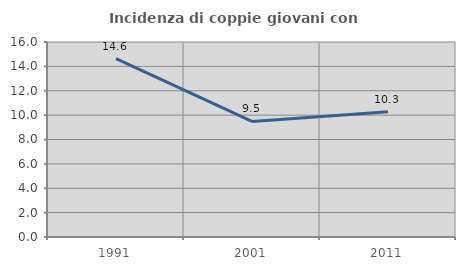
| Category | Incidenza di coppie giovani con figli |
|---|---|
| 1991.0 | 14.641 |
| 2001.0 | 9.479 |
| 2011.0 | 10.277 |